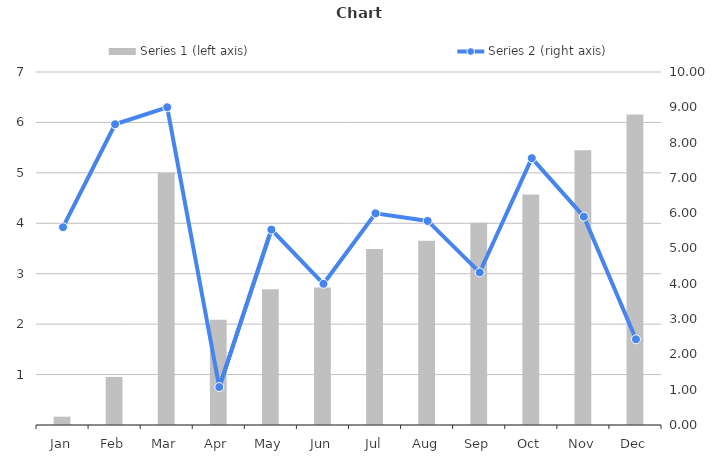
| Category | Series 1 (left axis) |
|---|---|
| Jan | 0.165 |
| Feb | 0.954 |
| Mar | 5 |
| Apr | 2.089 |
| May | 2.69 |
| Jun | 2.726 |
| Jul | 3.489 |
| Aug | 3.655 |
| Sep | 4.01 |
| Oct | 4.573 |
| Nov | 5.448 |
| Dec | 6.155 |